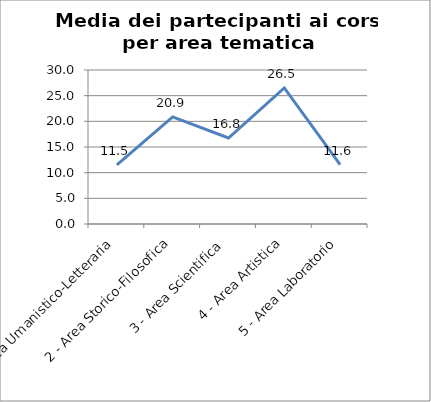
| Category | Media dei partecipanti ai corsi |
|---|---|
| 1 - Area Umanistico-Letteraria | 11.517 |
| 2 - Area Storico-Filosofica | 20.857 |
| 3 - Area Scientifica | 16.75 |
| 4 - Area Artistica | 26.5 |
| 5 - Area Laboratorio | 11.55 |